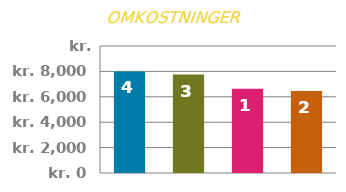
| Category | START |
|---|---|
| 0 | 8000 |
| 1 | 7750 |
| 2 | 6625 |
| 3 | 6450 |